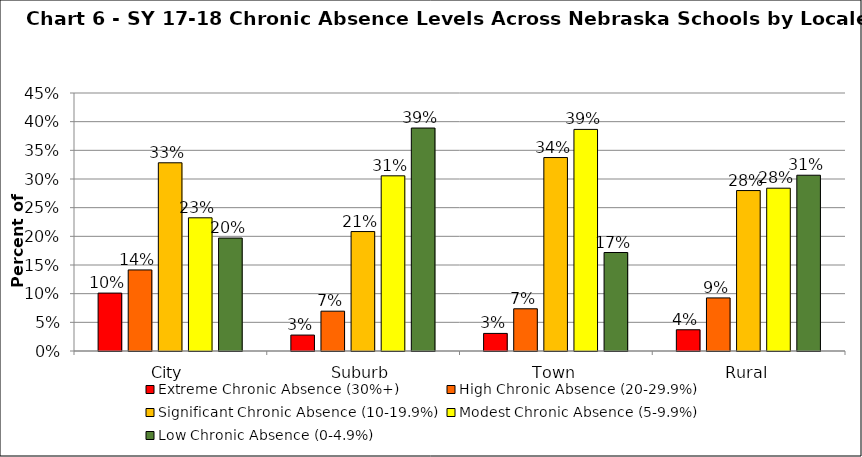
| Category | Extreme Chronic Absence (30%+) | High Chronic Absence (20-29.9%) | Significant Chronic Absence (10-19.9%) | Modest Chronic Absence (5-9.9%) | Low Chronic Absence (0-4.9%) |
|---|---|---|---|---|---|
| 0 | 0.101 | 0.141 | 0.328 | 0.232 | 0.197 |
| 1 | 0.028 | 0.069 | 0.208 | 0.306 | 0.389 |
| 2 | 0.031 | 0.074 | 0.337 | 0.387 | 0.172 |
| 3 | 0.037 | 0.093 | 0.28 | 0.284 | 0.307 |